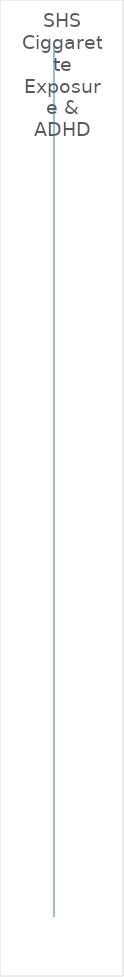
| Category | OR |
|---|---|
| 1.59 | 1 |
| nan | 2 |
| 1.84 | 3 |
| 1.9 | 4 |
| 2.18 | 5 |
| 3.14 | 8 |
| 2.39 | 9 |
| 1.35 | 10 |
| 1.83 | 11 |
| 1.1 | 12 |
| nan | 13 |
| 1.6820276496988864 | 14 |
| 1.7332530178673953 | 15 |
| 3.85 | 16 |
| 1.06 | 17 |
| nan | 18 |
| 1.336427488025472 | 19 |
| 1.2214027581601699 | 20 |
| 1.2586000099294778 | 21 |
| 1.4190675485932571 | 23 |
| 1.27 | 24 |
| 1.11 | 25 |